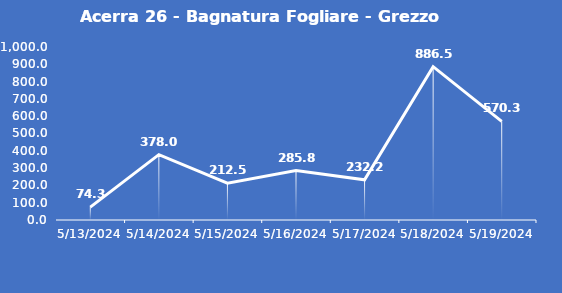
| Category | Acerra 26 - Bagnatura Fogliare - Grezzo (min) |
|---|---|
| 5/13/24 | 74.3 |
| 5/14/24 | 378 |
| 5/15/24 | 212.5 |
| 5/16/24 | 285.8 |
| 5/17/24 | 232.2 |
| 5/18/24 | 886.5 |
| 5/19/24 | 570.3 |